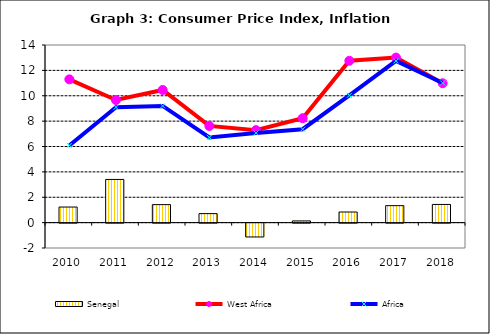
| Category | Senegal |
|---|---|
| 2010.0 | 1.229 |
| 2011.0 | 3.403 |
| 2012.0 | 1.418 |
| 2013.0 | 0.71 |
| 2014.0 | -1.09 |
| 2015.0 | 0.135 |
| 2016.0 | 0.837 |
| 2017.0 | 1.338 |
| 2018.0 | 1.433 |